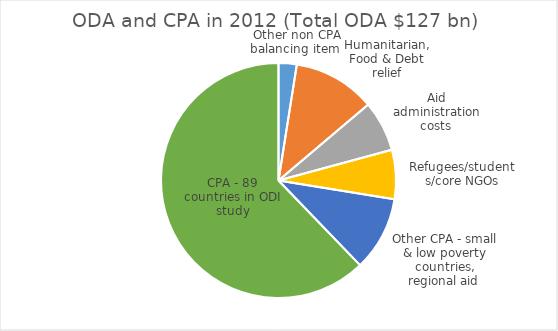
| Category | Series 0 |
|---|---|
| Other non CPA balancing item  | 3.175 |
| Humanitarian, Food & Debt relief | 14.375 |
| Aid administration costs  | 8.85 |
| Refugees/students/core NGOs | 8.6 |
| Other CPA - small & low poverty countries, regional aid  | 13 |
| CPA - 89 countries in ODI study | 79 |